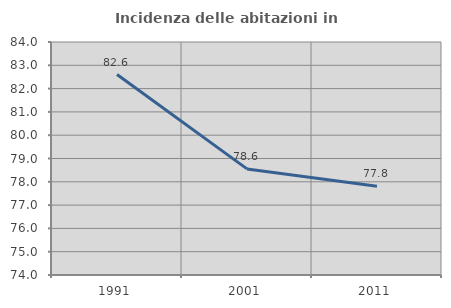
| Category | Incidenza delle abitazioni in proprietà  |
|---|---|
| 1991.0 | 82.604 |
| 2001.0 | 78.554 |
| 2011.0 | 77.807 |